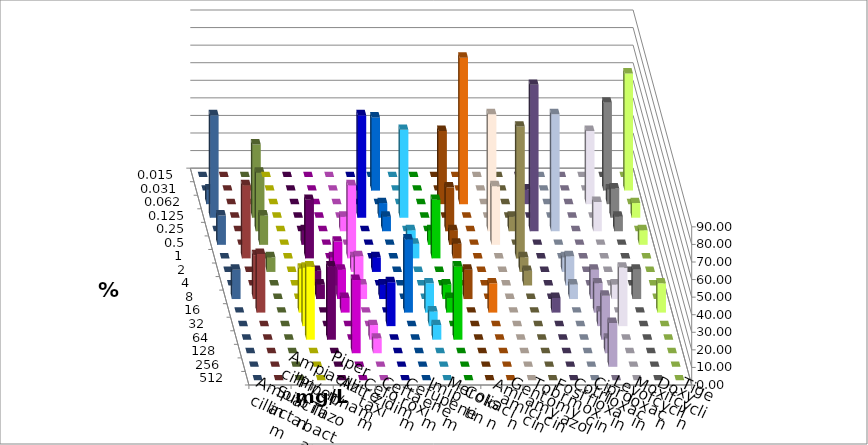
| Category | Ampicillin | Ampicillin/ Sulbactam | Piperacillin | Piperacillin/ Tazobactam | Aztreonam | Cefotaxim | Ceftazidim | Cefuroxim | Imipenem | Meropenem | Colistin | Amikacin | Gentamicin | Tobramycin | Fosfomycin | Cotrimoxazol | Ciprofloxacin | Levofloxacin | Moxifloxacin | Doxycyclin | Tigecyclin |
|---|---|---|---|---|---|---|---|---|---|---|---|---|---|---|---|---|---|---|---|---|---|
| 0.015 | 0 | 0 | 0 | 0 | 0 | 0 | 0 | 0 | 0 | 0 | 0 | 0 | 0 | 0 | 0 | 0 | 0 | 0 | 0 | 0 | 0 |
| 0.031 | 0 | 0 | 0 | 0 | 0 | 41.667 | 0 | 0 | 0 | 0 | 0 | 0 | 0 | 0 | 0 | 0 | 50 | 66.667 | 0 | 0 | 0 |
| 0.062 | 0 | 0 | 0 | 0 | 0 | 0 | 0 | 0 | 41.667 | 83.333 | 0 | 0 | 8.333 | 0 | 0 | 41.667 | 8.333 | 0 | 8.333 | 0 | 0 |
| 0.125 | 0 | 0 | 0 | 0 | 58.333 | 8.333 | 50 | 0 | 0 | 0 | 0 | 0 | 0 | 0 | 0 | 0 | 16.667 | 8.333 | 58.333 | 0 | 41.667 |
| 0.25 | 0 | 0 | 0 | 8.333 | 0 | 8.333 | 0 | 0 | 25 | 0 | 66.667 | 8.333 | 83.333 | 66.667 | 0 | 16.667 | 8.333 | 0 | 0 | 0 | 33.333 |
| 0.5 | 0 | 8.333 | 0 | 0 | 0 | 0 | 8.333 | 8.333 | 8.333 | 0 | 33.333 | 0 | 0 | 0 | 0 | 0 | 0 | 8.333 | 16.667 | 0 | 16.667 |
| 1.0 | 0 | 33.333 | 0 | 41.667 | 0 | 0 | 8.333 | 33.333 | 8.333 | 0 | 0 | 75 | 0 | 0 | 0 | 0 | 0 | 0 | 0 | 41.667 | 0 |
| 2.0 | 0 | 0 | 8.333 | 8.333 | 8.333 | 0 | 0 | 0 | 0 | 0 | 0 | 8.333 | 0 | 8.333 | 0 | 0 | 0 | 0 | 0 | 0 | 8.333 |
| 4.0 | 0 | 8.333 | 25 | 16.667 | 0 | 0 | 0 | 0 | 0 | 0 | 0 | 8.333 | 0 | 16.667 | 0 | 0 | 0 | 0 | 0 | 0 | 0 |
| 8.0 | 0 | 8.333 | 16.667 | 8.333 | 8.333 | 0 | 0 | 8.333 | 16.667 | 0 | 0 | 0 | 0 | 8.333 | 16.667 | 8.333 | 16.667 | 0 | 16.667 | 25 | 0 |
| 16.0 | 25 | 0 | 8.333 | 0 | 0 | 41.667 | 16.667 | 8.333 | 0 | 16.667 | 0 | 0 | 8.333 | 0 | 16.667 | 0 | 0 | 16.667 | 0 | 33.333 | 0 |
| 32.0 | 33.333 | 0 | 0 | 0 | 25 | 0 | 8.333 | 0 | 0 | 0 | 0 | 0 | 0 | 0 | 8.333 | 33.333 | 0 | 0 | 0 | 0 | 0 |
| 64.0 | 41.667 | 41.667 | 0 | 8.333 | 0 | 0 | 8.333 | 41.667 | 0 | 0 | 0 | 0 | 0 | 0 | 25 | 0 | 0 | 0 | 0 | 0 | 0 |
| 128.0 | 0 | 0 | 41.667 | 8.333 | 0 | 0 | 0 | 0 | 0 | 0 | 0 | 0 | 0 | 0 | 8.333 | 0 | 0 | 0 | 0 | 0 | 0 |
| 256.0 | 0 | 0 | 0 | 0 | 0 | 0 | 0 | 0 | 0 | 0 | 0 | 0 | 0 | 0 | 25 | 0 | 0 | 0 | 0 | 0 | 0 |
| 512.0 | 0 | 0 | 0 | 0 | 0 | 0 | 0 | 0 | 0 | 0 | 0 | 0 | 0 | 0 | 0 | 0 | 0 | 0 | 0 | 0 | 0 |